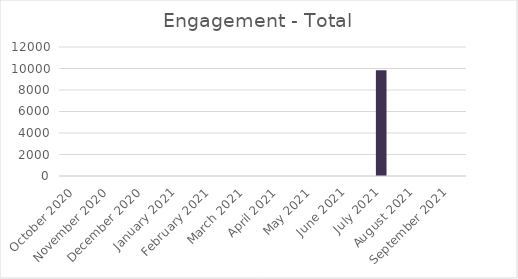
| Category | Total |
|---|---|
| October 2020 | 0 |
| November 2020 | 0 |
| December 2020 | 0 |
| January 2021 | 0 |
| February 2021 | 0 |
| March 2021 | 0 |
| April 2021 | 0 |
| May 2021 | 0 |
| June 2021 | 0 |
| July 2021 | 9831 |
| August 2021 | 0 |
| September 2021 | 0 |